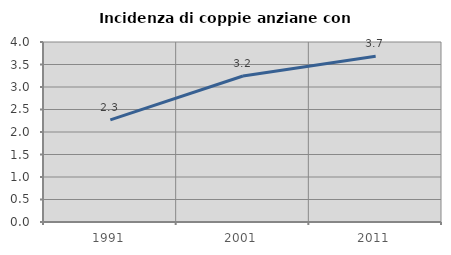
| Category | Incidenza di coppie anziane con figli |
|---|---|
| 1991.0 | 2.269 |
| 2001.0 | 3.244 |
| 2011.0 | 3.684 |